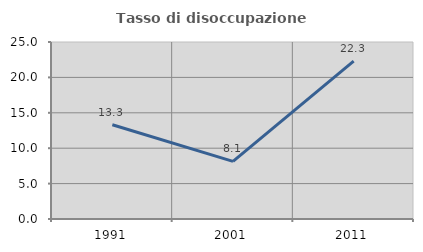
| Category | Tasso di disoccupazione giovanile  |
|---|---|
| 1991.0 | 13.311 |
| 2001.0 | 8.144 |
| 2011.0 | 22.308 |